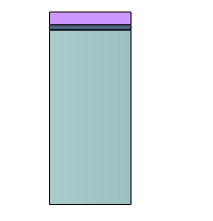
| Category | Series 0 | Series 1 | Series 2 |
|---|---|---|---|
| 0 | 713039.082 | 20459.153 | 53843.071 |